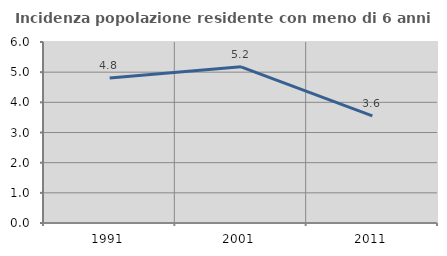
| Category | Incidenza popolazione residente con meno di 6 anni |
|---|---|
| 1991.0 | 4.806 |
| 2001.0 | 5.176 |
| 2011.0 | 3.55 |